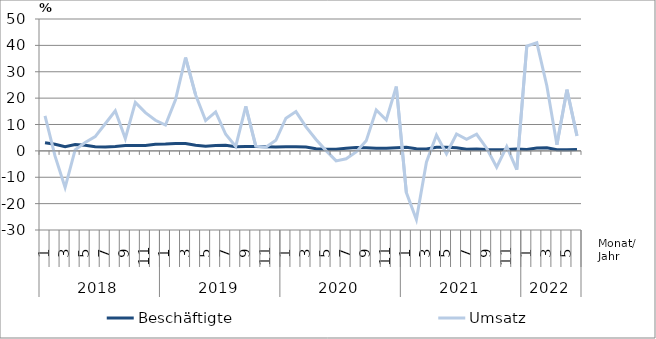
| Category | Beschäftigte | Umsatz |
|---|---|---|
| 0 | 3.1 | 13.3 |
| 1 | 2.5 | -2 |
| 2 | 1.6 | -13.9 |
| 3 | 2.4 | 0.4 |
| 4 | 2.1 | 3.2 |
| 5 | 1.6 | 5.4 |
| 6 | 1.5 | 10.3 |
| 7 | 1.7 | 15.2 |
| 8 | 2 | 4.7 |
| 9 | 2 | 18.4 |
| 10 | 2 | 14.5 |
| 11 | 2.5 | 11.6 |
| 12 | 2.6 | 9.8 |
| 13 | 2.8 | 19.4 |
| 14 | 2.8 | 35.4 |
| 15 | 2.1 | 21.3 |
| 16 | 1.8 | 11.5 |
| 17 | 2 | 14.8 |
| 18 | 2.1 | 6.3 |
| 19 | 1.6 | 1.7 |
| 20 | 1.7 | 16.9 |
| 21 | 1.7 | 1.8 |
| 22 | 1.6 | 1.4 |
| 23 | 1.5 | 4 |
| 24 | 1.6 | 12.4 |
| 25 | 1.6 | 14.9 |
| 26 | 1.5 | 9.1 |
| 27 | 0.8 | 4.3 |
| 28 | 0.6 | 0.1 |
| 29 | 0.6 | -3.8 |
| 30 | 1 | -3 |
| 31 | 1.3 | -0.4 |
| 32 | 1.2 | 3.8 |
| 33 | 1 | 15.5 |
| 34 | 1 | 11.7 |
| 35 | 1.2 | 24.4 |
| 36 | 1.4 | -15.8 |
| 37 | 0.8 | -26 |
| 38 | 0.7 | -4.3 |
| 39 | 1.4 | 6 |
| 40 | 1.4 | -1.1 |
| 41 | 1.2 | 6.4 |
| 42 | 0.6 | 4.4 |
| 43 | 0.7 | 6.3 |
| 44 | 0.5 | 1 |
| 45 | 0.4 | -6.2 |
| 46 | 0.5 | 1.6 |
| 47 | 0.7 | -7.1 |
| 48 | 0.5 | 39.7 |
| 49 | 1.1 | 41 |
| 50 | 1.2 | 24.6 |
| 51 | 0.4 | 2.3 |
| 52 | 0.4 | 23.2 |
| 53 | 0.5 | 5.7 |